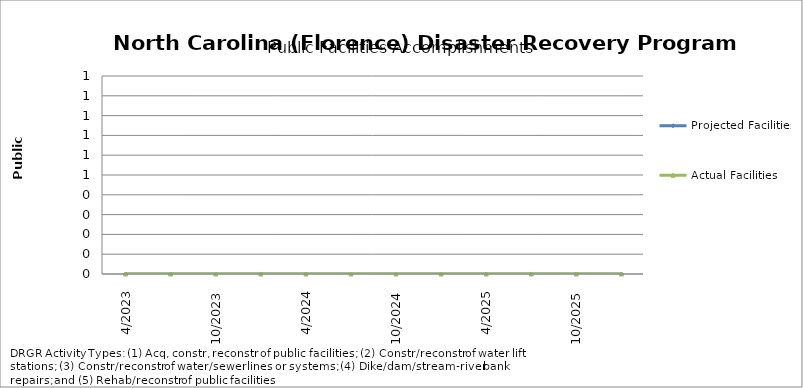
| Category | Projected Facilities | Actual Facilities |
|---|---|---|
| 4/2023 | 0 | 0 |
| 7/2023 | 0 | 0 |
| 10/2023 | 0 | 0 |
| 1/2024 | 0 | 0 |
| 4/2024 | 0 | 0 |
| 7/2024 | 0 | 0 |
| 10/2024 | 0 | 0 |
| 1/2025 | 0 | 0 |
| 4/2025 | 0 | 0 |
| 7/2025 | 0 | 0 |
| 10/2025 | 0 | 0 |
| 1/2026 | 0 | 0 |